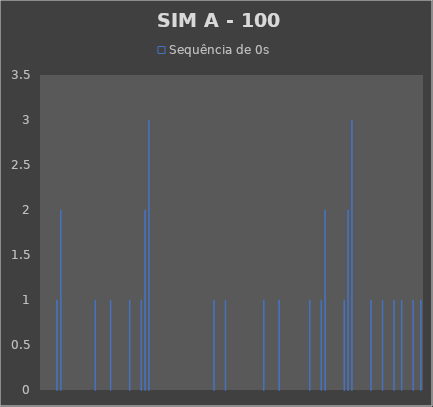
| Category | Sequência de 0s |
|---|---|
| 0 | 0 |
| 1 | 0 |
| 2 | 0 |
| 3 | 0 |
| 4 | 1 |
| 5 | 2 |
| 6 | 0 |
| 7 | 0 |
| 8 | 0 |
| 9 | 0 |
| 10 | 0 |
| 11 | 0 |
| 12 | 0 |
| 13 | 0 |
| 14 | 1 |
| 15 | 0 |
| 16 | 0 |
| 17 | 0 |
| 18 | 1 |
| 19 | 0 |
| 20 | 0 |
| 21 | 0 |
| 22 | 0 |
| 23 | 1 |
| 24 | 0 |
| 25 | 0 |
| 26 | 1 |
| 27 | 2 |
| 28 | 3 |
| 29 | 0 |
| 30 | 0 |
| 31 | 0 |
| 32 | 0 |
| 33 | 0 |
| 34 | 0 |
| 35 | 0 |
| 36 | 0 |
| 37 | 0 |
| 38 | 0 |
| 39 | 0 |
| 40 | 0 |
| 41 | 0 |
| 42 | 0 |
| 43 | 0 |
| 44 | 0 |
| 45 | 1 |
| 46 | 0 |
| 47 | 0 |
| 48 | 1 |
| 49 | 0 |
| 50 | 0 |
| 51 | 0 |
| 52 | 0 |
| 53 | 0 |
| 54 | 0 |
| 55 | 0 |
| 56 | 0 |
| 57 | 0 |
| 58 | 1 |
| 59 | 0 |
| 60 | 0 |
| 61 | 0 |
| 62 | 1 |
| 63 | 0 |
| 64 | 0 |
| 65 | 0 |
| 66 | 0 |
| 67 | 0 |
| 68 | 0 |
| 69 | 0 |
| 70 | 1 |
| 71 | 0 |
| 72 | 0 |
| 73 | 1 |
| 74 | 2 |
| 75 | 0 |
| 76 | 0 |
| 77 | 0 |
| 78 | 0 |
| 79 | 1 |
| 80 | 2 |
| 81 | 3 |
| 82 | 0 |
| 83 | 0 |
| 84 | 0 |
| 85 | 0 |
| 86 | 1 |
| 87 | 0 |
| 88 | 0 |
| 89 | 1 |
| 90 | 0 |
| 91 | 0 |
| 92 | 1 |
| 93 | 0 |
| 94 | 1 |
| 95 | 0 |
| 96 | 0 |
| 97 | 1 |
| 98 | 0 |
| 99 | 1 |